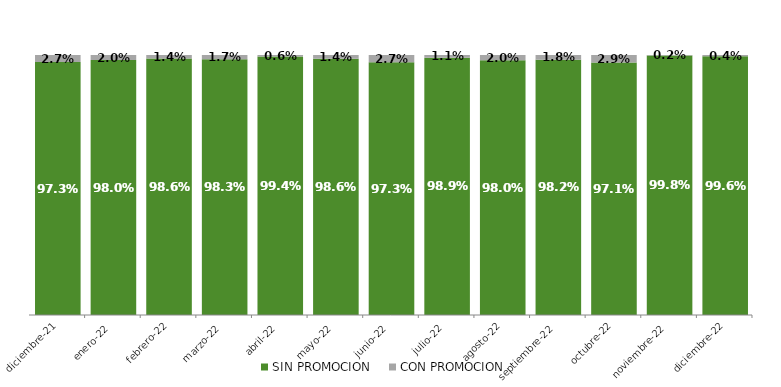
| Category | SIN PROMOCION   | CON PROMOCION   |
|---|---|---|
| 2021-12-01 | 0.973 | 0.027 |
| 2022-01-01 | 0.98 | 0.02 |
| 2022-02-01 | 0.986 | 0.014 |
| 2022-03-01 | 0.983 | 0.017 |
| 2022-04-01 | 0.994 | 0.006 |
| 2022-05-01 | 0.986 | 0.014 |
| 2022-06-01 | 0.973 | 0.027 |
| 2022-07-01 | 0.989 | 0.011 |
| 2022-08-01 | 0.98 | 0.02 |
| 2022-09-01 | 0.982 | 0.018 |
| 2022-10-01 | 0.971 | 0.029 |
| 2022-11-01 | 0.998 | 0.002 |
| 2022-12-01 | 0.996 | 0.004 |